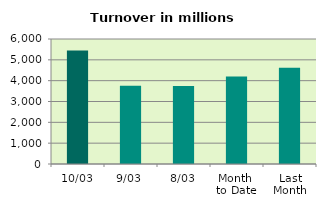
| Category | Series 0 |
|---|---|
| 10/03 | 5444.202 |
| 9/03 | 3761.373 |
| 8/03 | 3739.956 |
| Month 
to Date | 4202.697 |
| Last
Month | 4623.097 |